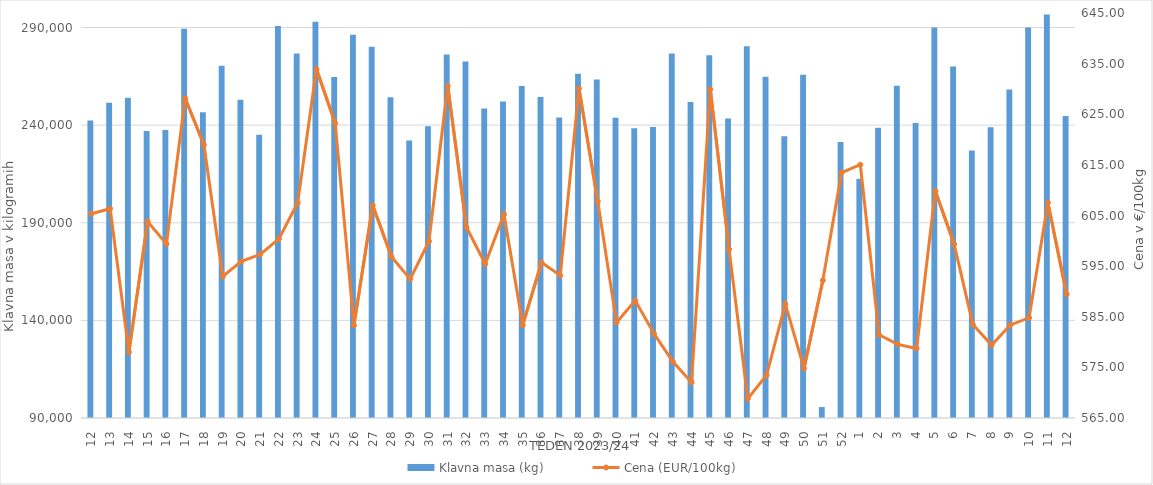
| Category | Klavna masa (kg) |
|---|---|
| 12.0 | 242369 |
| 13.0 | 251507 |
| 14.0 | 254072 |
| 15.0 | 236964 |
| 16.0 | 237552 |
| 17.0 | 289400 |
| 18.0 | 246616 |
| 19.0 | 270374 |
| 20.0 | 252984 |
| 21.0 | 235060 |
| 22.0 | 290816 |
| 23.0 | 276702 |
| 24.0 | 292976 |
| 25.0 | 264669 |
| 26.0 | 286237 |
| 27.0 | 280112 |
| 28.0 | 254336 |
| 29.0 | 232178 |
| 30.0 | 239437 |
| 31.0 | 276163 |
| 32.0 | 272647 |
| 33.0 | 248536 |
| 34.0 | 252050 |
| 35.0 | 260110 |
| 36.0 | 254389 |
| 37.0 | 243933 |
| 38.0 | 266321 |
| 39.0 | 263346 |
| 40.0 | 243765 |
| 41.0 | 238404 |
| 42.0 | 239007 |
| 43.0 | 276684 |
| 44.0 | 251832 |
| 45.0 | 275816 |
| 46.0 | 243425 |
| 47.0 | 280350 |
| 48.0 | 264849 |
| 49.0 | 234308 |
| 50.0 | 265786 |
| 51.0 | 95590 |
| 52.0 | 231370 |
| 1.0 | 212581 |
| 2.0 | 238607 |
| 3.0 | 260140 |
| 4.0 | 241148 |
| 5.0 | 290049 |
| 6.0 | 270025 |
| 7.0 | 227057 |
| 8.0 | 238927 |
| 9.0 | 258215 |
| 10.0 | 290025 |
| 11.0 | 296713 |
| 12.0 | 244673 |